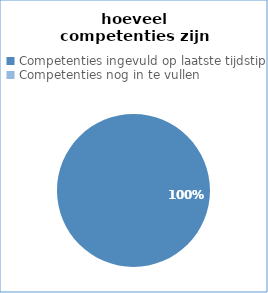
| Category | Series 3 |
|---|---|
| Competenties ingevuld op laatste tijdstip | 20 |
| Competenties nog in te vullen | 0 |